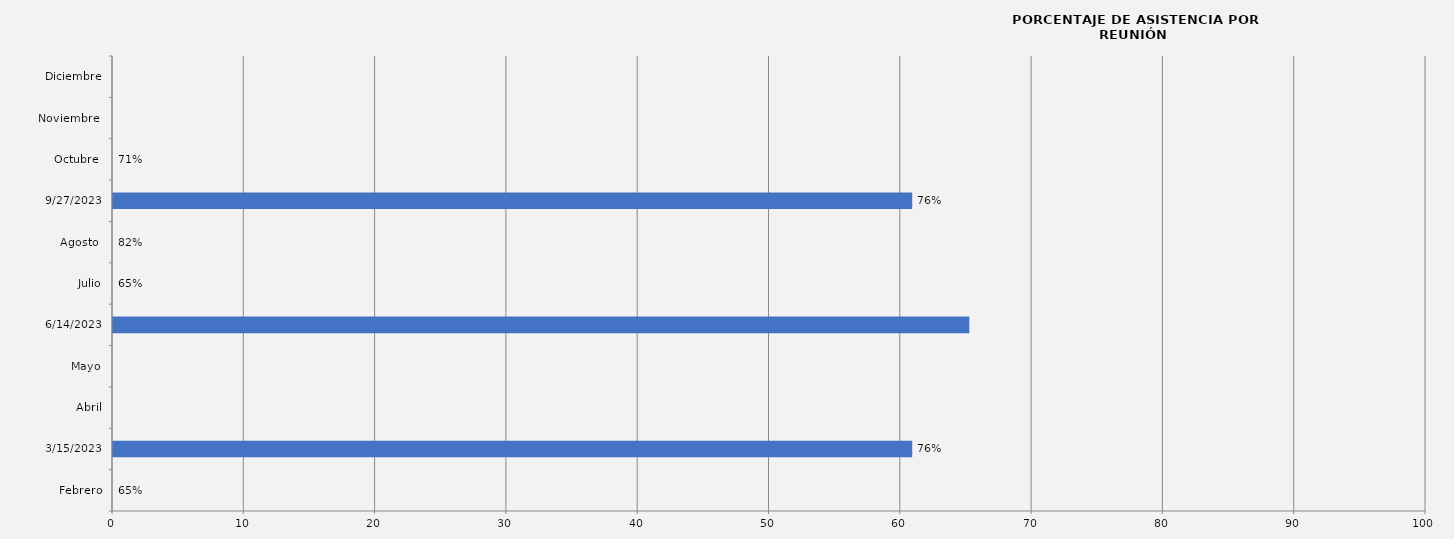
| Category | Series 0 |
|---|---|
| Febrero | 0 |
| 15/03/2023 | 60.87 |
| Abril | 0 |
| Mayo | 0 |
| 14/06/2023 | 65.217 |
| Julio | 0 |
| Agosto  | 0 |
| 27/09/2023 | 60.87 |
| Octubre  | 0 |
| Noviembre  | 0 |
| Diciembre | 0 |